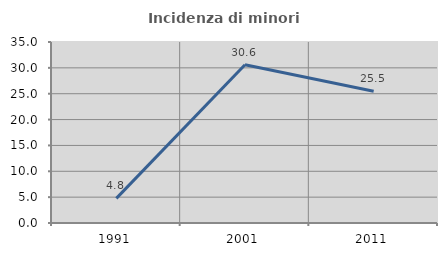
| Category | Incidenza di minori stranieri |
|---|---|
| 1991.0 | 4.762 |
| 2001.0 | 30.612 |
| 2011.0 | 25.49 |